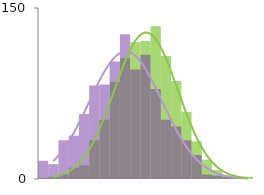
| Category | group 1 | normal 2 | group 2 | normal 1 |
|---|---|---|---|---|
| 0 | 1 | 11.333 | 16 | 0.987 |
| 1 | 2 | 19.981 | 13 | 2.597 |
| 2 | 4 | 32.514 | 34 | 6.145 |
| 3 | 10 | 48.834 | 38 | 13.064 |
| 4 | 12 | 67.694 | 57 | 24.961 |
| 5 | 34 | 86.609 | 82 | 42.862 |
| 6 | 52 | 102.274 | 83 | 66.145 |
| 7 | 85 | 111.469 | 103 | 91.735 |
| 8 | 106 | 112.132 | 127 | 114.337 |
| 9 | 120 | 104.11 | 96 | 128.071 |
| 10 | 121 | 89.216 | 109 | 128.922 |
| 11 | 134 | 70.564 | 79 | 116.633 |
| 12 | 108 | 51.511 | 52 | 94.826 |
| 13 | 86 | 34.707 | 46 | 69.287 |
| 14 | 59 | 21.583 | 34 | 45.497 |
| 15 | 33 | 12.388 | 21 | 26.849 |
| 16 | 17 | 6.562 | 4 | 14.24 |
| 17 | 8 | 3.209 | 3 | 6.787 |
| 18 | 3 | 1.448 | 2 | 2.907 |
| 19 | 2 | 0.603 | 1 | 1.119 |
| 20 | 2 | 0.232 | 0 | 0.387 |